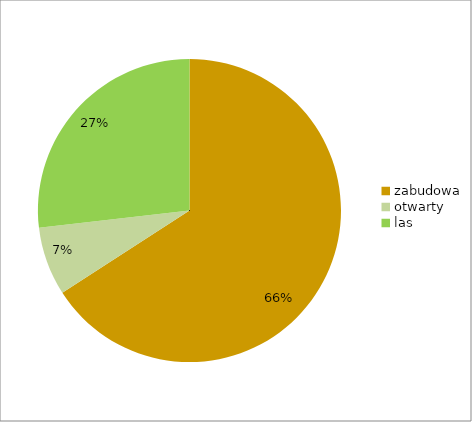
| Category | Series 0 |
|---|---|
| zabudowa | 0.659 |
| otwarty | 0.073 |
| las | 0.268 |